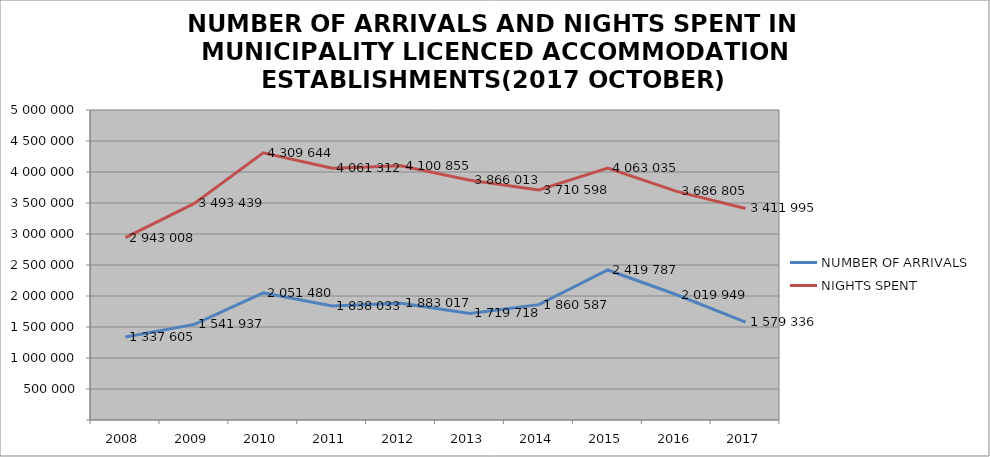
| Category | NUMBER OF ARRIVALS | NIGHTS SPENT |
|---|---|---|
| 2008 | 1337605 | 2943008 |
| 2009 | 1541937 | 3493439 |
| 2010 | 2051480 | 4309644 |
| 2011 | 1838033 | 4061312 |
| 2012 | 1883017 | 4100855 |
| 2013 | 1719718 | 3866013 |
| 2014 | 1860587 | 3710598 |
| 2015 | 2419787 | 4063035 |
| 2016 | 2019949 | 3686805 |
| 2017 | 1579336 | 3411995 |